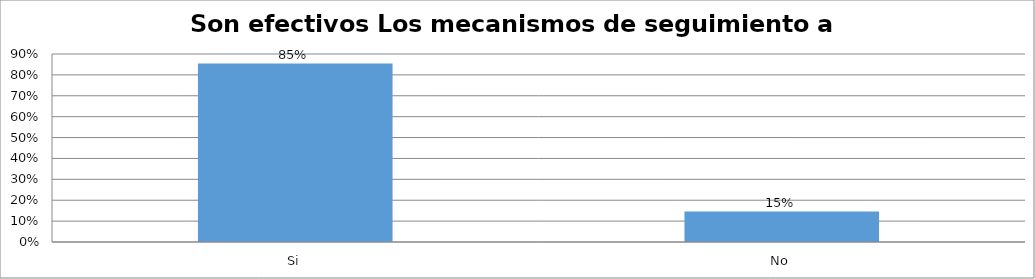
| Category | Series 0 |
|---|---|
| Si | 0.854 |
| No | 0.146 |